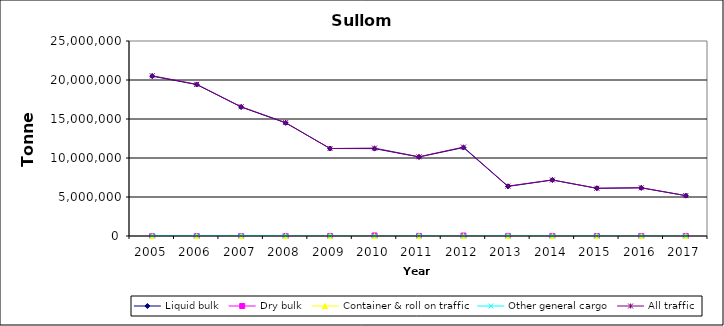
| Category | Liquid bulk | Dry bulk | Container & roll on traffic | Other general cargo | All traffic |
|---|---|---|---|---|---|
| 2005.0 | 20494000 | 0 | 0 | 47000 | 20541000 |
| 2006.0 | 19417000 | 0 | 0 | 30000 | 19447000 |
| 2007.0 | 16537000 | 0 | 0 | 36000 | 16573000 |
| 2008.0 | 14507000 | 0 | 0 | 32000 | 14539000 |
| 2009.0 | 11216595 | 0 | 0 | 0 | 11216595 |
| 2010.0 | 11202000 | 69000 | 0 | 0 | 11270000 |
| 2011.0 | 10134000 | 12000 | 0 | 7000 | 10153000 |
| 2012.0 | 11339000 | 57000 | 0 | 2000 | 11398000 |
| 2013.0 | 6357000 | 13000 | 0 | 24000 | 6394000 |
| 2014.0 | 7180000 | 0 | 0 | 5000 | 7185000 |
| 2015.0 | 6114000 | 5000 | 0 | 0 | 6120000 |
| 2016.0 | 6179000 | 4000 | 0 | 0 | 6183000 |
| 2017.0 | 5175000 | 3000 | 0 | 0 | 5179000 |